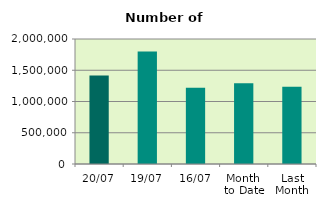
| Category | Series 0 |
|---|---|
| 20/07 | 1414182 |
| 19/07 | 1800774 |
| 16/07 | 1219804 |
| Month 
to Date | 1290313 |
| Last
Month | 1237407.909 |